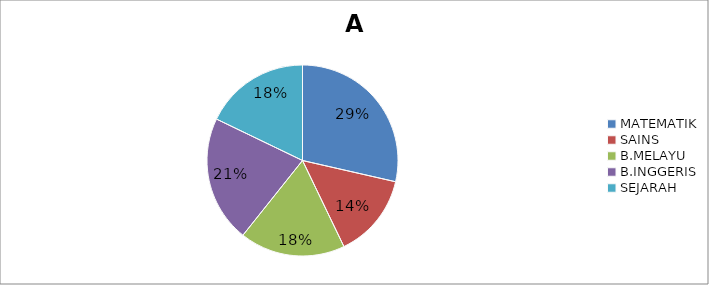
| Category | A | B | C | D | E |
|---|---|---|---|---|---|
| MATEMATIK | 8 | 1 | 3 | 0 | 0 |
| SAINS | 4 | 3 | 4 | 1 | 0 |
| B.MELAYU | 5 | 0 | 0 | 0 | 7 |
| B.INGGERIS | 6 | 1 | 1 | 1 | 3 |
| SEJARAH | 5 | 2 | 5 | 0 | 0 |